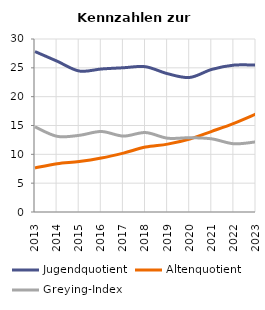
| Category | Jugendquotient | Altenquotient | Greying-Index |
|---|---|---|---|
| 2013.0 | 27.82 | 7.64 | 14.758 |
| 2014.0 | 26.152 | 8.372 | 13.122 |
| 2015.0 | 24.445 | 8.744 | 13.291 |
| 2016.0 | 24.798 | 9.353 | 13.958 |
| 2017.0 | 25.013 | 10.214 | 13.167 |
| 2018.0 | 25.191 | 11.264 | 13.777 |
| 2019.0 | 23.984 | 11.768 | 12.796 |
| 2020.0 | 23.33 | 12.66 | 12.88 |
| 2021.0 | 24.73 | 13.988 | 12.684 |
| 2022.0 | 25.47 | 15.37 | 11.83 |
| 2023.0 | 25.471 | 16.989 | 12.163 |